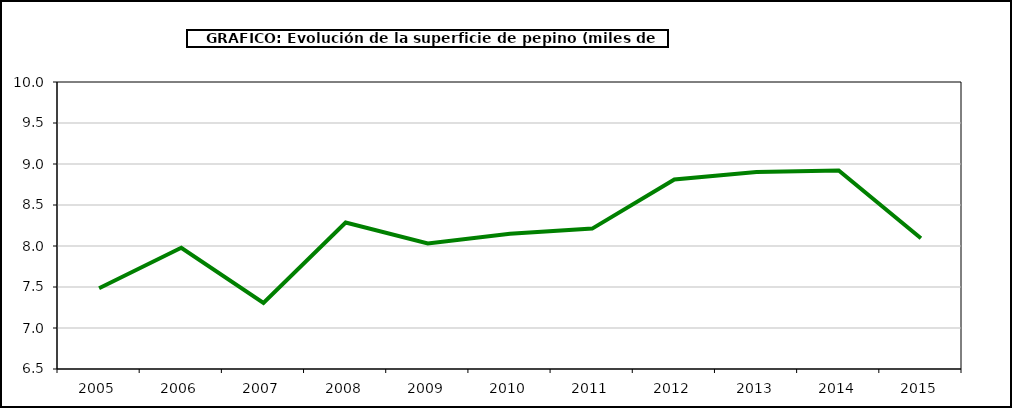
| Category | superficie |
|---|---|
| 2005.0 | 7.484 |
| 2006.0 | 7.979 |
| 2007.0 | 7.307 |
| 2008.0 | 8.286 |
| 2009.0 | 8.031 |
| 2010.0 | 8.148 |
| 2011.0 | 8.212 |
| 2012.0 | 8.811 |
| 2013.0 | 8.902 |
| 2014.0 | 8.921 |
| 2015.0 | 8.095 |